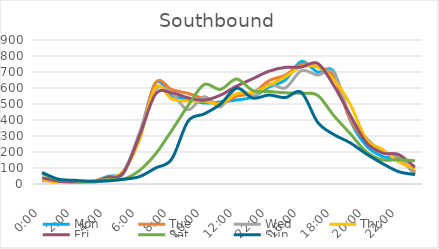
| Category | Mon | Tue | Wed | Thu | Fri | Sat | Sun |
|---|---|---|---|---|---|---|---|
| 0.0 | 27 | 28 | 21 | 32 | 39 | 65 | 72 |
| 0.041667 | 14 | 9 | 16 | 7 | 18 | 28 | 30 |
| 0.083333 | 4 | 10 | 10 | 13 | 9 | 20 | 23 |
| 0.125 | 9 | 5 | 10 | 19 | 10 | 10 | 17 |
| 0.166667 | 46 | 36 | 40 | 37 | 40 | 29 | 19 |
| 0.208333 | 77 | 72 | 62 | 77 | 69 | 30 | 29 |
| 0.25 | 303 | 300 | 319 | 274 | 299 | 84 | 46 |
| 0.291667 | 632 | 632 | 593 | 604 | 562 | 188 | 100 |
| 0.333333 | 552 | 590 | 566 | 531 | 570 | 335 | 156 |
| 0.375 | 530 | 566 | 464 | 519 | 539 | 489 | 392 |
| 0.416667 | 506 | 533 | 546 | 518 | 524 | 622 | 438 |
| 0.458333 | 513 | 503 | 482 | 501 | 555 | 591 | 499 |
| 0.5 | 525 | 549 | 600 | 564 | 612 | 656 | 599 |
| 0.541667 | 544 | 568 | 545 | 571 | 658 | 584 | 537 |
| 1900-01-02 22:00:00 | 606 | 646 | 624 | 618 | 705 | 578 | 556 |
| 0.625 | 650 | 680 | 600 | 670 | 729 | 570 | 540 |
| 0.666667 | 766 | 747 | 708 | 733 | 731 | 567 | 572 |
| 0.708333 | 700 | 733 | 681 | 730 | 754 | 554 | 386 |
| 0.75 | 701 | 668 | 696 | 651 | 615 | 427 | 309 |
| 0.791667 | 401 | 405 | 422 | 500 | 432 | 316 | 258 |
| 0.833333 | 239 | 268 | 288 | 280 | 260 | 202 | 188 |
| 0.875 | 172 | 205 | 199 | 216 | 194 | 151 | 128 |
| 0.916667 | 154 | 159 | 169 | 139 | 184 | 152 | 77 |
| 0.958333 | 67 | 75 | 58 | 97 | 105 | 145 | 59 |